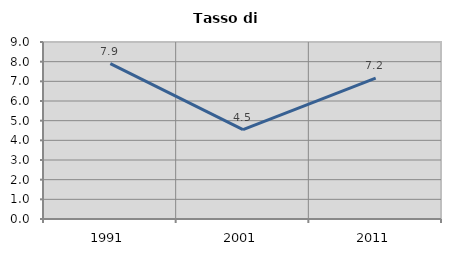
| Category | Tasso di disoccupazione   |
|---|---|
| 1991.0 | 7.897 |
| 2001.0 | 4.541 |
| 2011.0 | 7.16 |